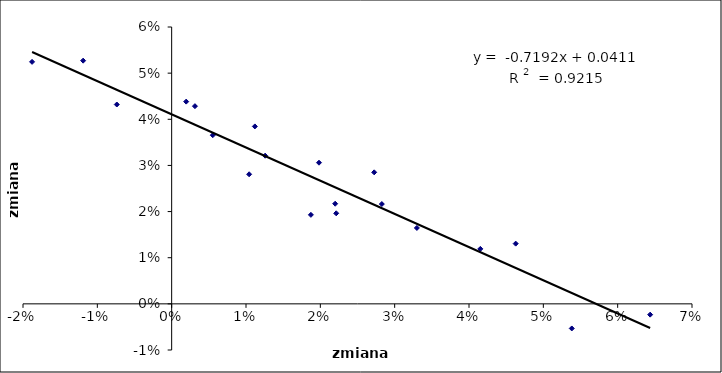
| Category | Series 0 |
|---|---|
| 0.041527798023282665 | 0.012 |
| 0.010421988989360819 | 0.028 |
| 0.003130208133268999 | 0.043 |
| 0.0187299797194332 | 0.019 |
| 0.005530531724302143 | 0.037 |
| 0.06437032861962563 | -0.002 |
| 0.027242997557569072 | 0.029 |
| 0.022135477679054015 | 0.02 |
| 0.011191811893406012 | 0.038 |
| -0.01190987122352494 | 0.053 |
| 0.0019533827371257494 | 0.044 |
| -0.018777294614807934 | 0.052 |
| 0.04628022256738576 | 0.013 |
| 0.02827074330003815 | 0.022 |
| 0.02199623948686968 | 0.022 |
| 0.03298773056108488 | 0.016 |
| 0.05382809835949077 | -0.005 |
| 0.012573041094801778 | 0.032 |
| -0.007382523751094015 | 0.043 |
| 0.019818587396745274 | 0.031 |